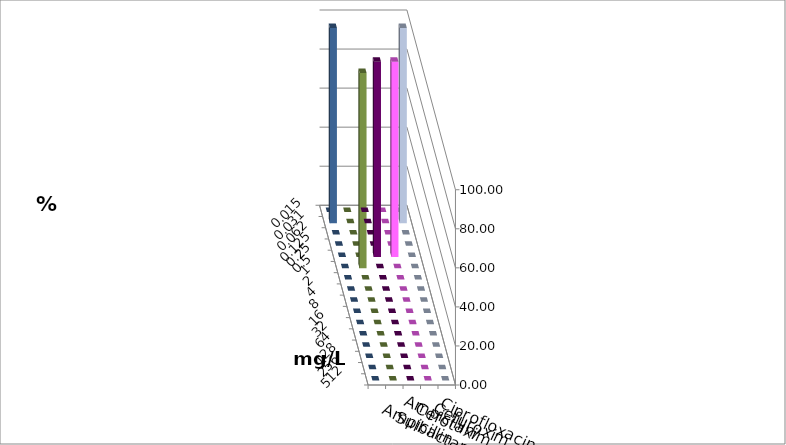
| Category | Ampicillin | Ampicillin/ Sulbactam | Cefotaxim | Cefuroxim | Ciprofloxacin |
|---|---|---|---|---|---|
| 0.015 | 0 | 0 | 0 | 0 | 0 |
| 0.031 | 0 | 0 | 100 | 0 | 100 |
| 0.062 | 0 | 0 | 0 | 0 | 0 |
| 0.125 | 0 | 0 | 0 | 0 | 0 |
| 0.25 | 100 | 100 | 0 | 0 | 0 |
| 0.5 | 0 | 0 | 0 | 100 | 0 |
| 1.0 | 0 | 0 | 0 | 0 | 0 |
| 2.0 | 0 | 0 | 0 | 0 | 0 |
| 4.0 | 0 | 0 | 0 | 0 | 0 |
| 8.0 | 0 | 0 | 0 | 0 | 0 |
| 16.0 | 0 | 0 | 0 | 0 | 0 |
| 32.0 | 0 | 0 | 0 | 0 | 0 |
| 64.0 | 0 | 0 | 0 | 0 | 0 |
| 128.0 | 0 | 0 | 0 | 0 | 0 |
| 256.0 | 0 | 0 | 0 | 0 | 0 |
| 512.0 | 0 | 0 | 0 | 0 | 0 |